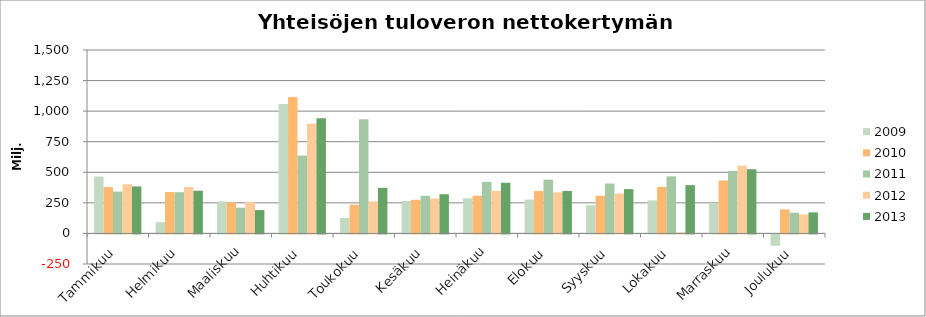
| Category | 2009 | 2010 | 2011 | 2012 | 2013 |
|---|---|---|---|---|---|
| Tammikuu | 464.899 | 378.86 | 341.987 | 401.627 | 384.485 |
| Helmikuu | 92.021 | 339.045 | 337.078 | 379.401 | 349.199 |
| Maaliskuu | 261.783 | 253.057 | 210.203 | 256.28 | 190.945 |
| Huhtikuu | 1059.201 | 1115.624 | 636.437 | 897.203 | 940.935 |
| Toukokuu | 126.163 | 234.756 | 933.434 | 262.244 | 372.901 |
| Kesäkuu | 265.105 | 274.88 | 307.856 | 285.13 | 320.319 |
| Heinäkuu | 286.978 | 308.391 | 421.522 | 347.389 | 414.27 |
| Elokuu | 277.363 | 347.548 | 439.399 | 335.795 | 347.137 |
| Syyskuu | 230.468 | 308.333 | 407.65 | 326.578 | 362.569 |
| Lokakuu | 270.56 | 380.508 | 466.894 | 9.04 | 394.905 |
| Marraskuu | 249.968 | 432.891 | 511.438 | 554.296 | 524.993 |
| Joulukuu | -92.536 | 196.924 | 169.141 | 155.44 | 172.137 |